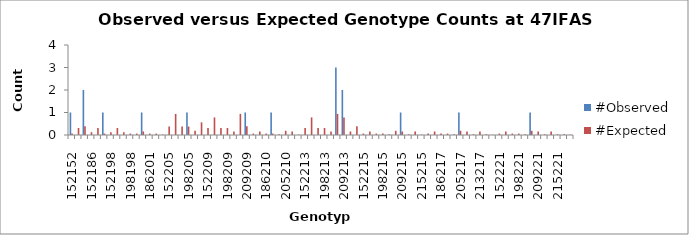
| Category | #Observed | #Expected |
|---|---|---|
| 152152.0 | 1 | 0.062 |
| 152162.0 | 0 | 0.312 |
| 162162.0 | 2 | 0.391 |
| 152186.0 | 0 | 0.125 |
| 162186.0 | 0 | 0.312 |
| 186186.0 | 1 | 0.062 |
| 152198.0 | 0 | 0.125 |
| 162198.0 | 0 | 0.312 |
| 186198.0 | 0 | 0.125 |
| 198198.0 | 0 | 0.062 |
| 152201.0 | 0 | 0.062 |
| 162201.0 | 1 | 0.156 |
| 186201.0 | 0 | 0.062 |
| 198201.0 | 0 | 0.062 |
| 201201.0 | 0 | 0.016 |
| 152205.0 | 0 | 0.375 |
| 162205.0 | 0 | 0.938 |
| 186205.0 | 0 | 0.375 |
| 198205.0 | 1 | 0.375 |
| 201205.0 | 0 | 0.188 |
| 205205.0 | 0 | 0.562 |
| 152209.0 | 0 | 0.312 |
| 162209.0 | 0 | 0.781 |
| 186209.0 | 0 | 0.312 |
| 198209.0 | 0 | 0.312 |
| 201209.0 | 0 | 0.156 |
| 205209.0 | 0 | 0.938 |
| 209209.0 | 1 | 0.391 |
| 152210.0 | 0 | 0.062 |
| 162210.0 | 0 | 0.156 |
| 186210.0 | 0 | 0.062 |
| 198210.0 | 1 | 0.062 |
| 201210.0 | 0 | 0.031 |
| 205210.0 | 0 | 0.188 |
| 209210.0 | 0 | 0.156 |
| 210210.0 | 0 | 0.016 |
| 152213.0 | 0 | 0.312 |
| 162213.0 | 0 | 0.781 |
| 186213.0 | 0 | 0.312 |
| 198213.0 | 0 | 0.312 |
| 201213.0 | 0 | 0.156 |
| 205213.0 | 3 | 0.938 |
| 209213.0 | 2 | 0.781 |
| 210213.0 | 0 | 0.156 |
| 213213.0 | 0 | 0.391 |
| 152215.0 | 0 | 0.062 |
| 162215.0 | 0 | 0.156 |
| 186215.0 | 0 | 0.062 |
| 198215.0 | 0 | 0.062 |
| 201215.0 | 0 | 0.031 |
| 205215.0 | 0 | 0.188 |
| 209215.0 | 1 | 0.156 |
| 210215.0 | 0 | 0.031 |
| 213215.0 | 0 | 0.156 |
| 215215.0 | 0 | 0.016 |
| 152217.0 | 0 | 0.062 |
| 162217.0 | 0 | 0.156 |
| 186217.0 | 0 | 0.062 |
| 198217.0 | 0 | 0.062 |
| 201217.0 | 0 | 0.031 |
| 205217.0 | 1 | 0.188 |
| 209217.0 | 0 | 0.156 |
| 210217.0 | 0 | 0.031 |
| 213217.0 | 0 | 0.156 |
| 215217.0 | 0 | 0.031 |
| 217217.0 | 0 | 0.016 |
| 152221.0 | 0 | 0.062 |
| 162221.0 | 0 | 0.156 |
| 186221.0 | 0 | 0.062 |
| 198221.0 | 0 | 0.062 |
| 201221.0 | 0 | 0.031 |
| 205221.0 | 1 | 0.188 |
| 209221.0 | 0 | 0.156 |
| 210221.0 | 0 | 0.031 |
| 213221.0 | 0 | 0.156 |
| 215221.0 | 0 | 0.031 |
| 217221.0 | 0 | 0.031 |
| 221221.0 | 0 | 0.016 |